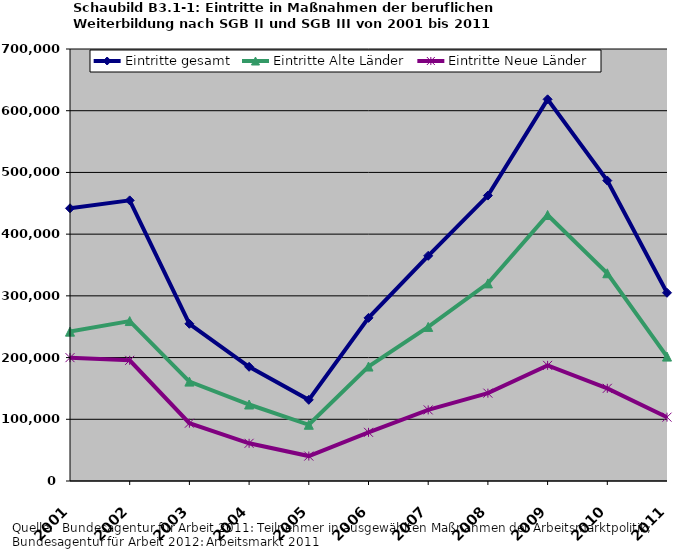
| Category | Eintritte gesamt | Eintritte Alte Länder | Eintritte Neue Länder |
|---|---|---|---|
| 2001.0 | 441907 | 242012 | 199895 |
| 2002.0 | 454699 | 259166 | 195533 |
| 2003.0 | 254718 | 161042 | 93676 |
| 2004.0 | 185041 | 123952 | 61089 |
| 2005.0 | 131521 | 91096 | 40425 |
| 2006.0 | 264343 | 185457 | 78886 |
| 2007.0 | 364894 | 249675 | 115219 |
| 2008.0 | 462532 | 320217 | 142315 |
| 2009.0 | 618435 | 431065 | 187370 |
| 2010.0 | 486795 | 336627 | 150168 |
| 2011.0 | 304991 | 201560 | 103431 |